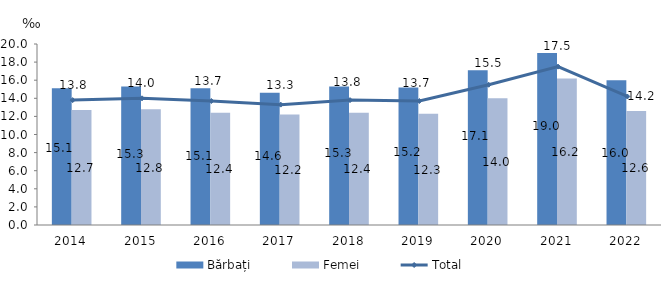
| Category | Bărbați | Femei |
|---|---|---|
| 2014.0 | 15.1 | 12.7 |
| 2015.0 | 15.3 | 12.8 |
| 2016.0 | 15.1 | 12.4 |
| 2017.0 | 14.6 | 12.2 |
| 2018.0 | 15.3 | 12.4 |
| 2019.0 | 15.2 | 12.3 |
| 2020.0 | 17.1 | 14 |
| 2021.0 | 19 | 16.2 |
| 2022.0 | 16 | 12.6 |